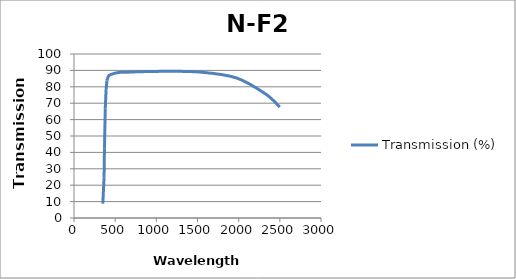
| Category | Transmission (%) |
|---|---|
| 350.0 | 8.771 |
| 365.0 | 24.612 |
| 370.0 | 42.22 |
| 380.0 | 66.933 |
| 390.0 | 78.472 |
| 400.0 | 83.851 |
| 405.0 | 84.687 |
| 420.0 | 86.659 |
| 436.0 | 87.21 |
| 460.0 | 87.701 |
| 500.0 | 88.322 |
| 546.0 | 88.741 |
| 580.0 | 88.827 |
| 620.0 | 88.822 |
| 660.0 | 88.891 |
| 700.0 | 89.038 |
| 1060.0 | 89.411 |
| 1530.0 | 88.977 |
| 1970.0 | 85.46 |
| 2325.0 | 75.695 |
| 2500.0 | 67.648 |